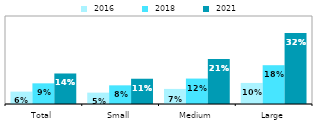
| Category |  2016 |  2018 |  2021 |
|---|---|---|---|
| Total | 0.056 | 0.094 | 0.139 |
| Small | 0.052 | 0.085 | 0.115 |
| Medium | 0.069 | 0.116 | 0.205 |
| Large | 0.096 | 0.176 | 0.322 |